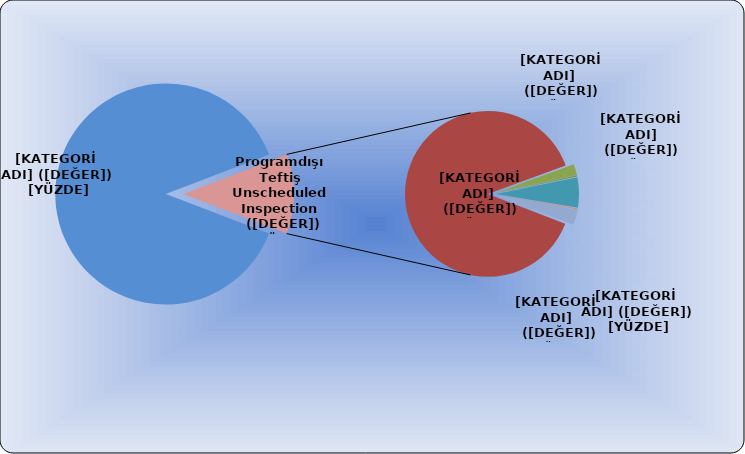
| Category | Series 0 |
|---|---|
| Programlı teftiş Scheduled inspections | 15761 |
| Talebe ilişkin inceleme Made on demand | 1843 |
| İş kazası Occupational injuries   | 45 |
| Meslek hastalığı Occupational diseases   | 5 |
| İşin Durdurulmasının Kaldırılması Talebi Demand  about Abolition of Cessation of Work  | 122 |
| Güvenlik Raporu Safety Report | 3 |
| Diğer Other | 63 |